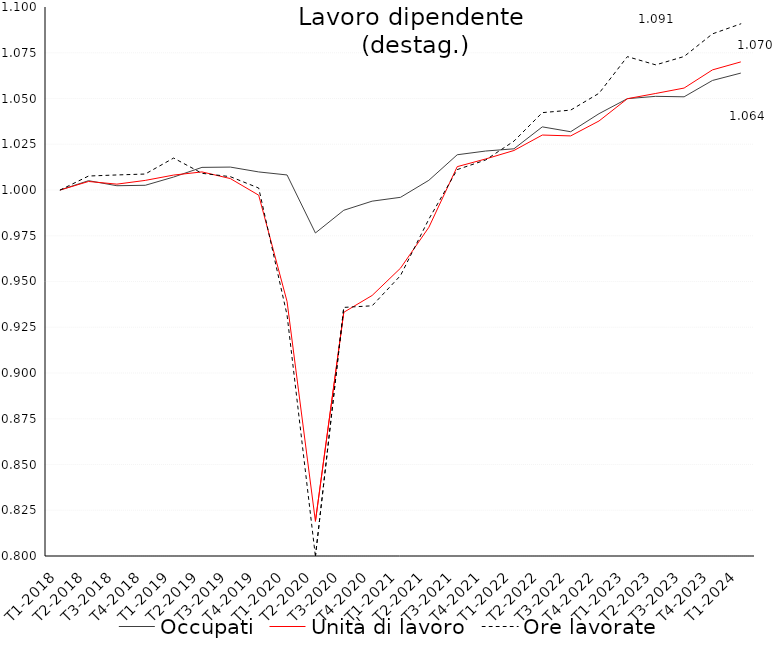
| Category | Occupati | Unità di lavoro | Ore lavorate |
|---|---|---|---|
| T1-2018 | 1 | 1 | 1 |
| T2-2018 | 1.005 | 1.005 | 1.008 |
| T3-2018 | 1.002 | 1.003 | 1.008 |
| T4-2018 | 1.003 | 1.005 | 1.009 |
| T1-2019 | 1.007 | 1.008 | 1.017 |
| T2-2019 | 1.012 | 1.01 | 1.009 |
| T3-2019 | 1.013 | 1.006 | 1.007 |
| T4-2019 | 1.01 | 0.997 | 1.001 |
| T1-2020 | 1.008 | 0.939 | 0.932 |
| T2-2020 | 0.977 | 0.819 | 0.8 |
| T3-2020 | 0.989 | 0.933 | 0.936 |
| T4-2020 | 0.994 | 0.942 | 0.937 |
| T1-2021 | 0.996 | 0.957 | 0.953 |
| T2-2021 | 1.005 | 0.98 | 0.984 |
| T3-2021 | 1.019 | 1.013 | 1.011 |
| T4-2021 | 1.021 | 1.017 | 1.016 |
| T1-2022 | 1.023 | 1.022 | 1.027 |
| T2-2022 | 1.035 | 1.03 | 1.042 |
| T3-2022 | 1.032 | 1.03 | 1.044 |
| T4-2022 | 1.042 | 1.038 | 1.053 |
| T1-2023 | 1.05 | 1.05 | 1.073 |
| T2-2023 | 1.051 | 1.053 | 1.068 |
| T3-2023 | 1.051 | 1.056 | 1.073 |
| T4-2023 | 1.06 | 1.066 | 1.085 |
| T1-2024 | 1.064 | 1.07 | 1.091 |